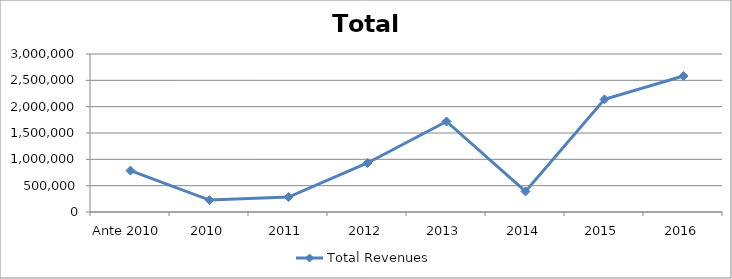
| Category | Total Revenues |
|---|---|
| Ante 2010 | 786000 |
| 2010 | 226000 |
| 2011 | 282823 |
| 2012 | 930600 |
| 2013 | 1718832.27 |
| 2014 | 390200 |
| 2015 | 2138229.027 |
| 2016 | 2581897.314 |